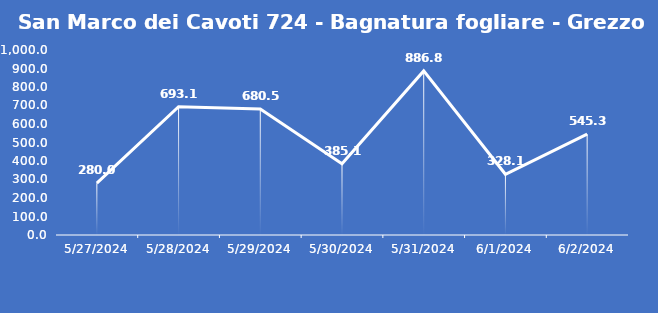
| Category | San Marco dei Cavoti 724 - Bagnatura fogliare - Grezzo (min) |
|---|---|
| 5/27/24 | 280 |
| 5/28/24 | 693.1 |
| 5/29/24 | 680.5 |
| 5/30/24 | 385.1 |
| 5/31/24 | 886.8 |
| 6/1/24 | 328.1 |
| 6/2/24 | 545.3 |